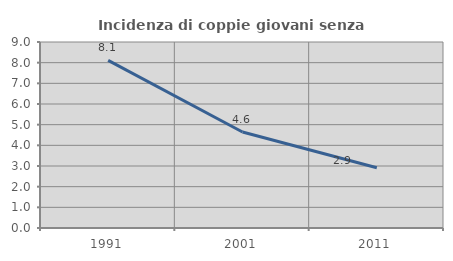
| Category | Incidenza di coppie giovani senza figli |
|---|---|
| 1991.0 | 8.108 |
| 2001.0 | 4.645 |
| 2011.0 | 2.918 |